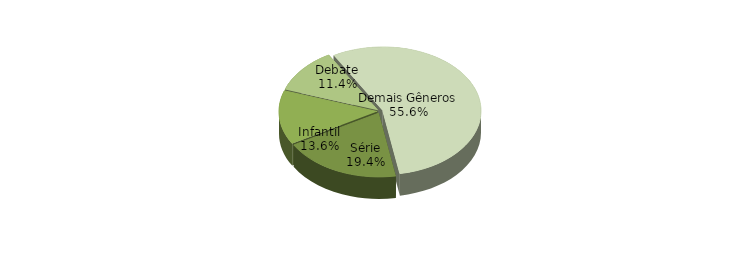
| Category | Series 0 |
|---|---|
| Série | 0.194 |
| Infantil | 0.136 |
| Debate | 0.114 |
| Demais Gêneros | 0.556 |